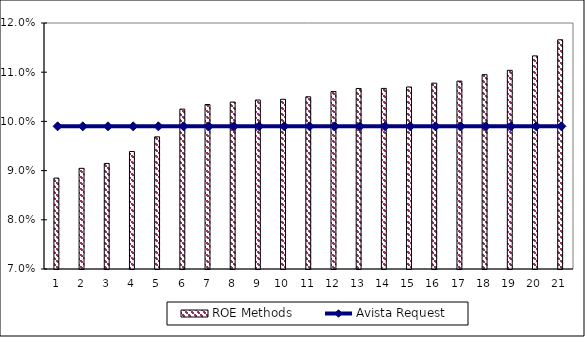
| Category | ROE Methods |
|---|---|
| 1.0 | 0.088 |
| 2.0 | 0.09 |
| 3.0 | 0.091 |
| 4.0 | 0.094 |
| 5.0 | 0.097 |
| 6.0 | 0.103 |
| 7.0 | 0.103 |
| 8.0 | 0.104 |
| 9.0 | 0.104 |
| 10.0 | 0.104 |
| 11.0 | 0.105 |
| 12.0 | 0.106 |
| 13.0 | 0.107 |
| 14.0 | 0.107 |
| 15.0 | 0.107 |
| 16.0 | 0.108 |
| 17.0 | 0.108 |
| 18.0 | 0.11 |
| 19.0 | 0.11 |
| 20.0 | 0.113 |
| 21.0 | 0.117 |